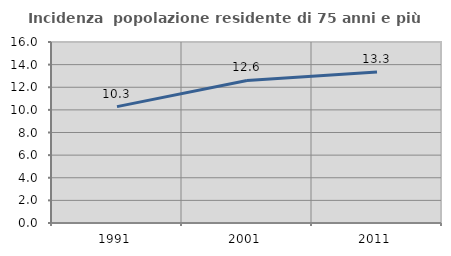
| Category | Incidenza  popolazione residente di 75 anni e più |
|---|---|
| 1991.0 | 10.29 |
| 2001.0 | 12.605 |
| 2011.0 | 13.34 |